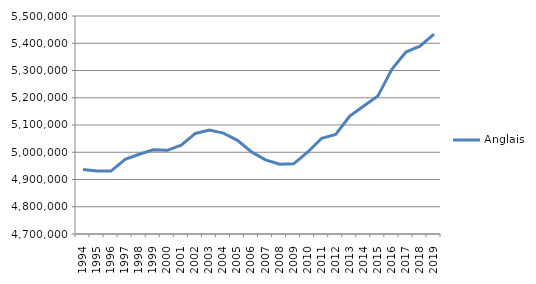
| Category | Anglais |
|---|---|
| 1994 | 4936800 |
| 1995 | 4931231 |
| 1996 | 4931044 |
| 1997 | 4973636 |
| 1998 | 4992537 |
| 1999 | 5009315 |
| 2000 | 5007048 |
| 2001 | 5026369 |
| 2002 | 5068986 |
| 2003 | 5081277 |
| 2004 | 5070430 |
| 2005 | 5043735 |
| 2006 | 5001177 |
| 2007 | 4972119 |
| 2008 | 4955918 |
| 2009 | 4957505 |
| 2010 | 5000140 |
| 2011 | 5051419 |
| 2012 | 5065531 |
| 2013 | 5132964 |
| 2014 | 5169926 |
| 2015 | 5206068 |
| 2016 | 5304329 |
| 2017 | 5367696 |
| 2018 | 5389243 |
| 2019 | 5433702 |